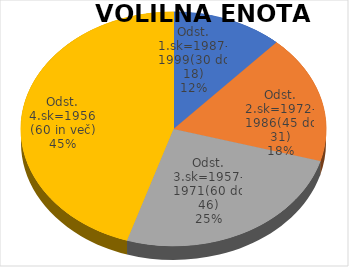
| Category | VOLILNA ENOTA 04 |
|---|---|
| Odst. 1.sk=1987-1999(30 do 18) | 2.63 |
| Odst. 2.sk=1972-1986(45 do 31) | 3.95 |
| Odst. 3.sk=1957-1971(60 do 46) | 5.7 |
| Odst. 4.sk=1956 (60 in več) | 10.08 |